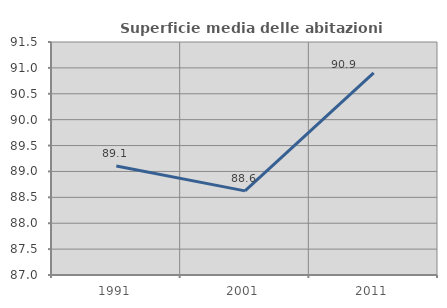
| Category | Superficie media delle abitazioni occupate |
|---|---|
| 1991.0 | 89.105 |
| 2001.0 | 88.624 |
| 2011.0 | 90.906 |